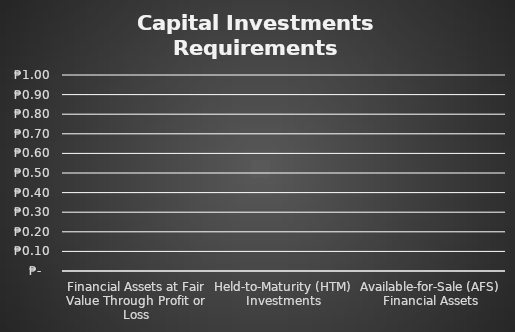
| Category | Series 2 |
|---|---|
| Financial Assets at Fair Value Through Profit or Loss | 0 |
| Held-to-Maturity (HTM) Investments | 0 |
| Available-for-Sale (AFS) Financial Assets | 0 |